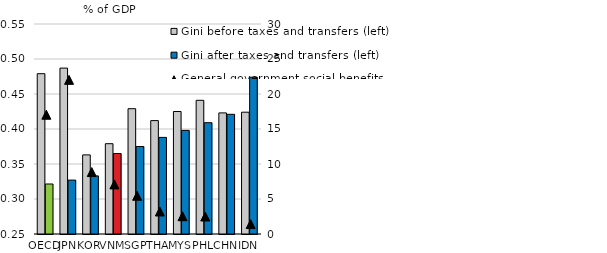
| Category | Gini before taxes and transfers (left) | Gini after taxes and transfers (left) |
|---|---|---|
| OECD | 0.479 | 0.321 |
| JPN | 0.487 | 0.327 |
| KOR | 0.363 | 0.333 |
| VNM | 0.379 | 0.365 |
| SGP | 0.429 | 0.375 |
| THA | 0.412 | 0.388 |
| MYS | 0.425 | 0.398 |
| PHL | 0.441 | 0.409 |
| CHN | 0.423 | 0.421 |
| IDN | 0.424 | 0.474 |